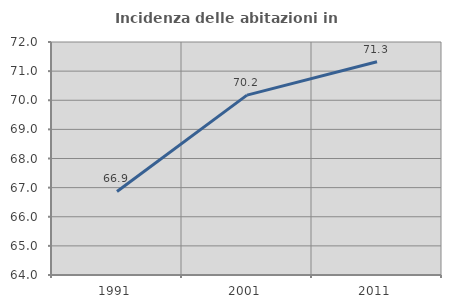
| Category | Incidenza delle abitazioni in proprietà  |
|---|---|
| 1991.0 | 66.87 |
| 2001.0 | 70.177 |
| 2011.0 | 71.324 |